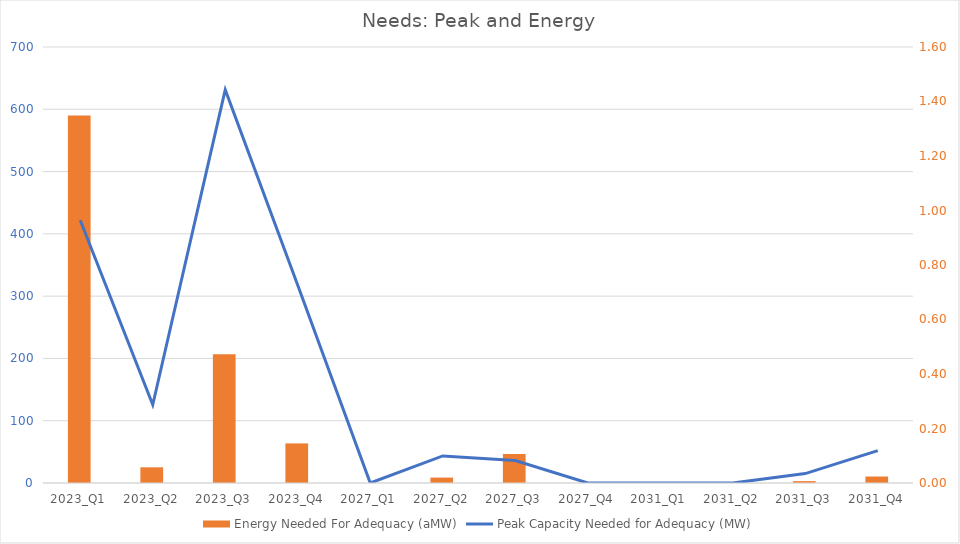
| Category | Energy Needed For Adequacy (aMW) |
|---|---|
| 2023_Q1 | 1.349 |
| 2023_Q2 | 0.057 |
| 2023_Q3 | 0.472 |
| 2023_Q4 | 0.145 |
| 2027_Q1 | 0 |
| 2027_Q2 | 0.02 |
| 2027_Q3 | 0.106 |
| 2027_Q4 | 0 |
| 2031_Q1 | 0 |
| 2031_Q2 | 0 |
| 2031_Q3 | 0.007 |
| 2031_Q4 | 0.024 |